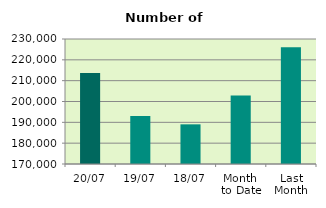
| Category | Series 0 |
|---|---|
| 20/07 | 213640 |
| 19/07 | 193062 |
| 18/07 | 189036 |
| Month 
to Date | 202911.857 |
| Last
Month | 226069.545 |